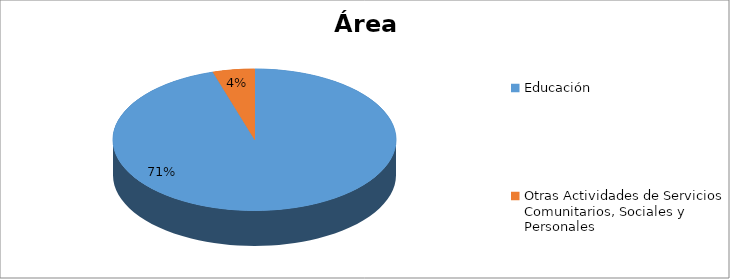
| Category | Series 0 |
|---|---|
| Educación | 0.714 |
| Otras Actividades de Servicios Comunitarios, Sociales y Personales | 0.036 |